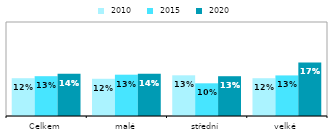
| Category |  2010 |  2015 |  2020 |
|---|---|---|---|
| Celkem | 0.121 | 0.127 | 0.135 |
| malé | 0.119 | 0.132 | 0.135 |
| střední | 0.13 | 0.104 | 0.127 |
| velké | 0.121 | 0.13 | 0.171 |